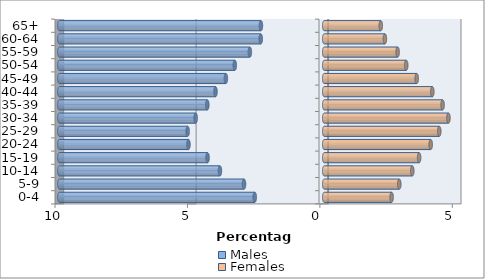
| Category | Males | Females |
|---|---|---|
| 0-4 | -2.624 | 2.545 |
| 5-9 | -3.027 | 2.834 |
| 10-14 | -3.937 | 3.325 |
| 15-19 | -4.404 | 3.583 |
| 20-24 | -5.125 | 4.02 |
| 25-29 | -5.156 | 4.343 |
| 30-34 | -4.853 | 4.69 |
| 35-39 | -4.414 | 4.469 |
| 40-44 | -4.105 | 4.081 |
| 45-49 | -3.713 | 3.492 |
| 50-54 | -3.376 | 3.096 |
| 55-59 | -2.807 | 2.771 |
| 60-64 | -2.395 | 2.291 |
| 65+ | -2.389 | 2.135 |